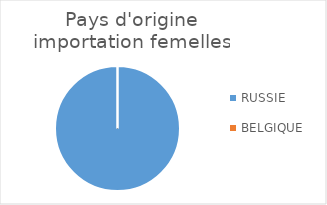
| Category | Series 0 |
|---|---|
| RUSSIE | 1 |
| BELGIQUE | 0 |